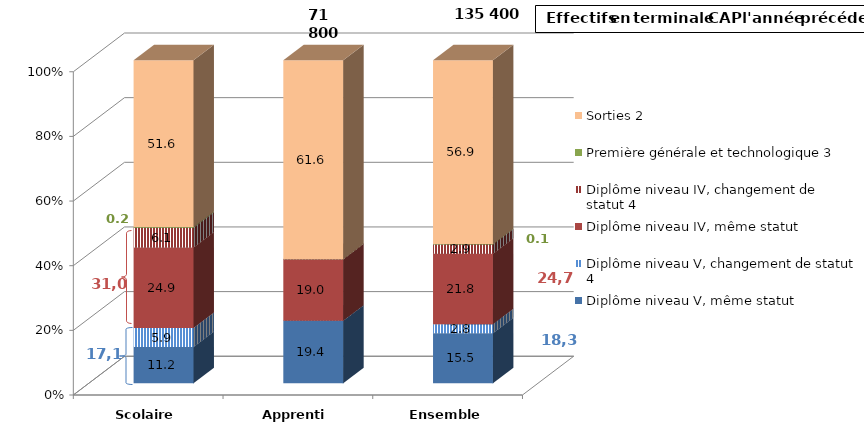
| Category | Diplôme niveau V, même statut | Diplôme niveau V, changement de statut 4 | Diplôme niveau IV, même statut | Diplôme niveau IV, changement de statut 4 | Première générale et technologique 3 | Sorties 2 |
|---|---|---|---|---|---|---|
| Scolaire | 11.223 | 5.898 | 24.883 | 6.124 | 0.247 | 51.625 |
| Apprenti | 19.37 | 0.011 | 19.026 | 0.02 | 0.001 | 61.569 |
| Ensemble | 15.542 | 2.777 | 21.778 | 2.888 | 0.117 | 56.896 |